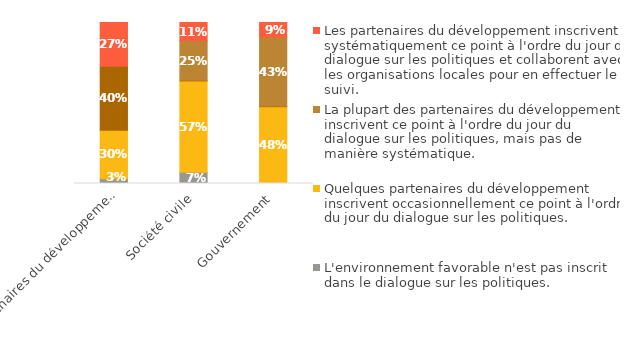
| Category | L'environnement favorable n'est pas inscrit dans le dialogue sur les politiques. | Quelques partenaires du développement inscrivent occasionnellement ce point à l'ordre du jour du dialogue sur les politiques. | La plupart des partenaires du développement inscrivent ce point à l'ordre du jour du dialogue sur les politiques, mais pas de manière systématique. | Les partenaires du développement inscrivent systématiquement ce point à l'ordre du jour du dialogue sur les politiques et collaborent avec les organisations locales pour en effectuer le suivi. |
|---|---|---|---|---|
| Gouvernement | 0 | 0.477 | 0.432 | 0.091 |
| Société civile | 0.07 | 0.568 | 0.25 | 0.114 |
| Partenaires du développement | 0.03 | 0.303 | 0.4 | 0.273 |